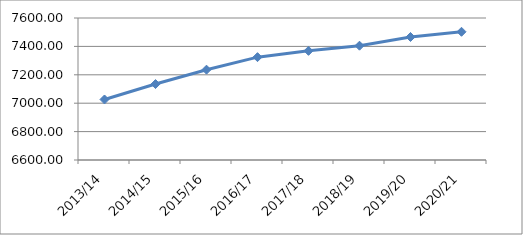
| Category | Series 0 |
|---|---|
| 2013/14 | 7026.07 |
| 2014/15 | 7134.86 |
| 2015/16 | 7236.01 |
| 2016/17 | 7324.34 |
| 2017/18 | 7368.7 |
| 2018/19 | 7404.8 |
| 2019/20 | 7466.25 |
| 2020/21 | 7503.008 |